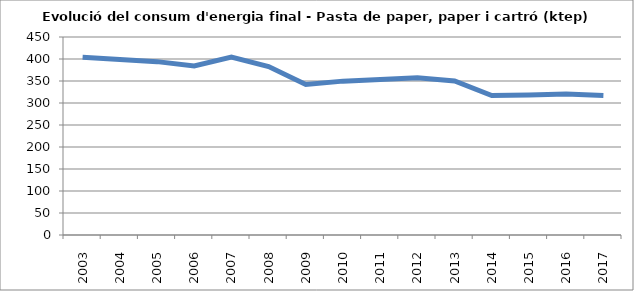
| Category | 404,0 398,8 394,0 384,3 404,2 382,8 342,1 349,7 353,4 357,4 349,9 317,1 318,3 320,5 317,3 |
|---|---|
| 2003.0 | 404 |
| 2004.0 | 398.8 |
| 2005.0 | 394 |
| 2006.0 | 384.3 |
| 2007.0 | 404.2 |
| 2008.0 | 382.8 |
| 2009.0 | 342.1 |
| 2010.0 | 349.7 |
| 2011.0 | 353.4 |
| 2012.0 | 357.4 |
| 2013.0 | 349.9 |
| 2014.0 | 317.1 |
| 2015.0 | 318.3 |
| 2016.0 | 320.5 |
| 2017.0 | 317.3 |